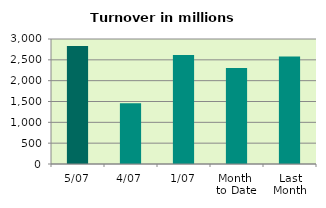
| Category | Series 0 |
|---|---|
| 5/07 | 2831.489 |
| 4/07 | 1456.681 |
| 1/07 | 2616.075 |
| Month 
to Date | 2301.415 |
| Last
Month | 2579.746 |